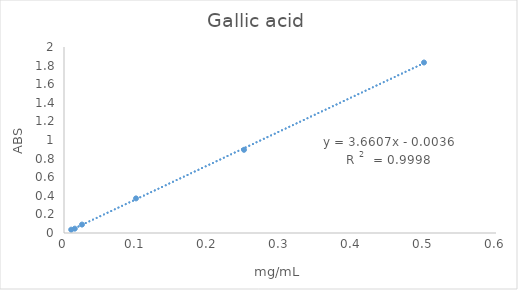
| Category | Series 0 |
|---|---|
| 0.01 | 0.036 |
| 0.015 | 0.047 |
| 0.025 | 0.091 |
| 0.1 | 0.372 |
| 0.25 | 0.895 |
| 0.5 | 1.833 |